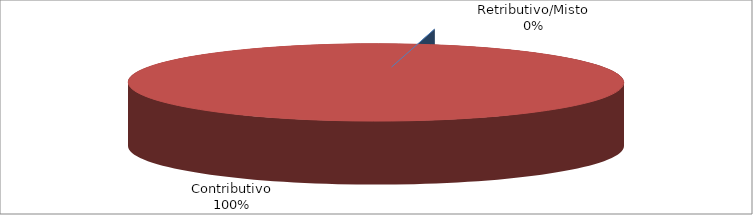
| Category | Decorrenti ANNO 2021 |
|---|---|
| Retributivo/Misto | 0 |
| Contributivo | 39163 |